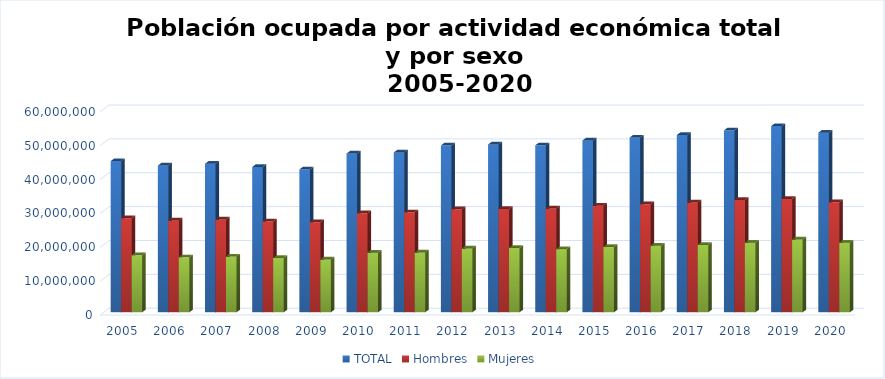
| Category | TOTAL | Hombres | Mujeres |
|---|---|---|---|
| 2005.0 | 44651832 | 27804532 | 16847300 |
| 2006.0 | 43344281 | 27100806 | 16243475 |
| 2007.0 | 43866696 | 27401679 | 16465017 |
| 2008.0 | 42906656 | 26840614 | 16066042 |
| 2009.0 | 42197775 | 26597896 | 15599879 |
| 2010.0 | 46890584 | 29279550 | 17611034 |
| 2011.0 | 47182447 | 29530140 | 17652307 |
| 2012.0 | 49280265 | 30431016 | 18849249 |
| 2013.0 | 49549331 | 30521397 | 19027934 |
| 2014.0 | 49305839 | 30645359 | 18660480 |
| 2015.0 | 50734656 | 31457961 | 19276695 |
| 2016.0 | 51594748.25 | 31899192 | 19695556.25 |
| 2017.0 | 52340749.25 | 32428169.5 | 19912579.75 |
| 2018.0 | 53721194.5 | 33152388.75 | 20568805.75 |
| 2019.0 | 54993593.5 | 33501774 | 21491819.5 |
| 2020.0 | 53033793.375 | 32487165.625 | 20546627.75 |